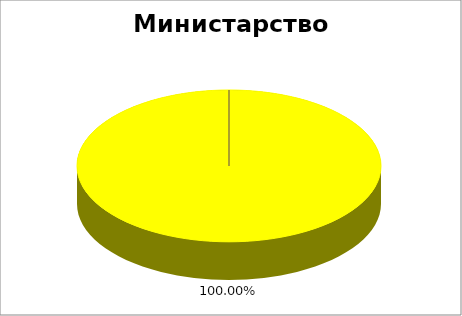
| Category | Министарство одбране |
|---|---|
| 0 | 0 |
| 1 | 0 |
| 2 | 1 |
| 3 | 0 |
| 4 | 0 |